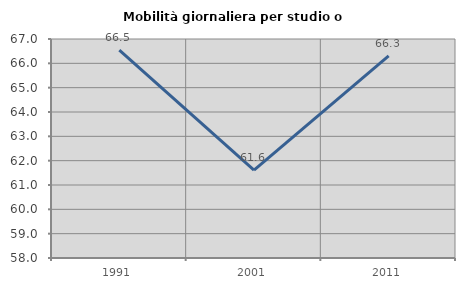
| Category | Mobilità giornaliera per studio o lavoro |
|---|---|
| 1991.0 | 66.538 |
| 2001.0 | 61.613 |
| 2011.0 | 66.307 |